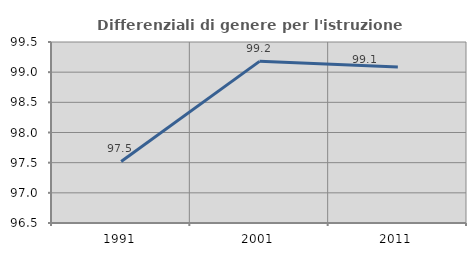
| Category | Differenziali di genere per l'istruzione superiore |
|---|---|
| 1991.0 | 97.519 |
| 2001.0 | 99.179 |
| 2011.0 | 99.087 |